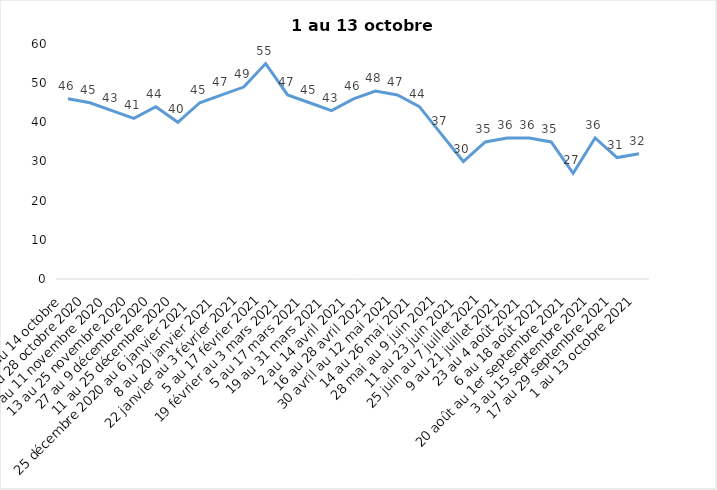
| Category | Toujours aux trois mesures |
|---|---|
| 2 au 14 octobre  | 46 |
| 16 au 28 octobre 2020 | 45 |
| 30 octobre au 11 novembre 2020 | 43 |
| 13 au 25 novembre 2020 | 41 |
| 27 au 9 décembre 2020 | 44 |
| 11 au 25 décembre 2020 | 40 |
| 25 décembre 2020 au 6 janvier 2021 | 45 |
| 8 au 20 janvier 2021 | 47 |
| 22 janvier au 3 février 2021 | 49 |
| 5 au 17 février 2021 | 55 |
| 19 février au 3 mars 2021 | 47 |
| 5 au 17 mars 2021 | 45 |
| 19 au 31 mars 2021 | 43 |
| 2 au 14 avril 2021 | 46 |
| 16 au 28 avril 2021 | 48 |
| 30 avril au 12 mai 2021 | 47 |
| 14 au 26 mai 2021 | 44 |
| 28 mai au 9 juin 2021 | 37 |
| 11 au 23 juin 2021 | 30 |
| 25 juin au 7 juillet 2021 | 35 |
| 9 au 21 juillet 2021 | 36 |
| 23 au 4 août 2021 | 36 |
| 6 au 18 août 2021 | 35 |
| 20 août au 1er septembre 2021 | 27 |
| 3 au 15 septembre 2021 | 36 |
| 17 au 29 septembre 2021 | 31 |
| 1 au 13 octobre 2021 | 32 |